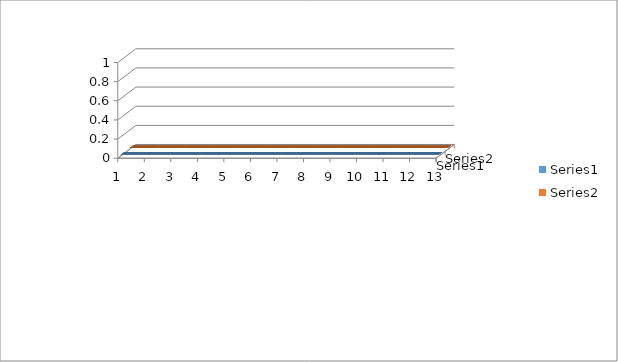
| Category | Series 0 | Series 1 |
|---|---|---|
| 0 | 106 | 106 |
| 1 | 105 | 105 |
| 2 | 104 | 104 |
| 3 | 103 | 102 |
| 4 | 103 | 100 |
| 5 | 104 | 104 |
| 6 | 105 | 104 |
| 7 | 105 | 104 |
| 8 | 105 | 105 |
| 9 | 103 | 104 |
| 10 | 105 | 107 |
| 11 | 108 | 109 |
| 12 | 1256 | 1254 |